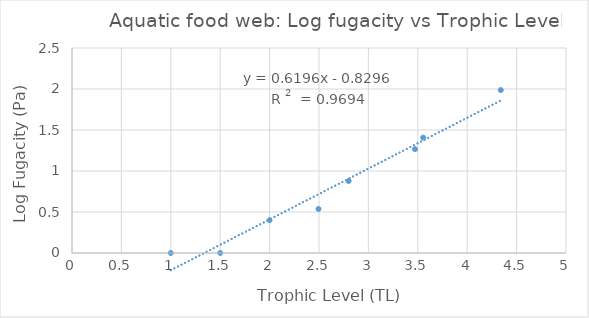
| Category | Log fugacity vs Trophic Level |
|---|---|
| 1.5 | 0 |
| 1.0 | 0 |
| 2.0 | 0.4 |
| 2.8 | 0.877 |
| 2.495 | 0.537 |
| 3.47175 | 1.266 |
| 3.5542499999999997 | 1.407 |
| 4.3399 | 1.987 |